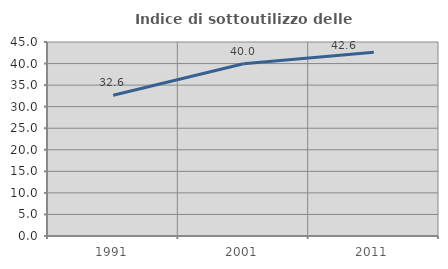
| Category | Indice di sottoutilizzo delle abitazioni  |
|---|---|
| 1991.0 | 32.629 |
| 2001.0 | 39.967 |
| 2011.0 | 42.6 |